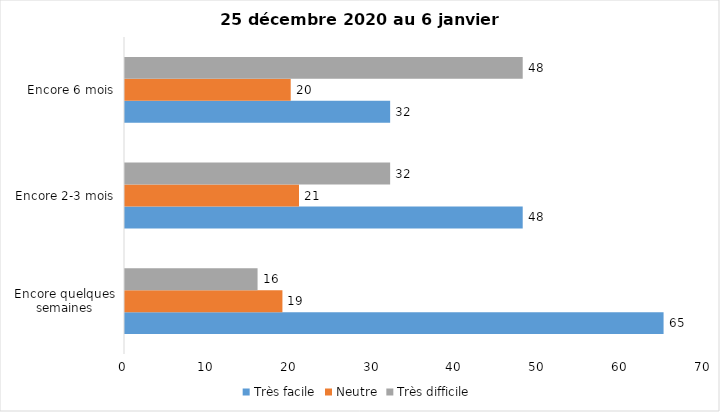
| Category | Très facile | Neutre | Très difficile |
|---|---|---|---|
| Encore quelques semaines | 65 | 19 | 16 |
| Encore 2-3 mois | 48 | 21 | 32 |
| Encore 6 mois | 32 | 20 | 48 |